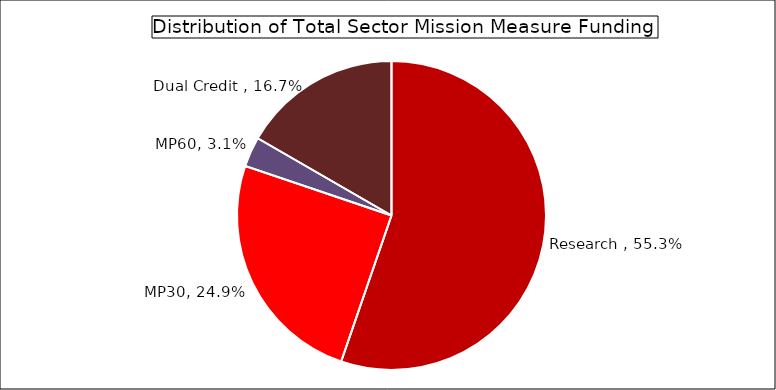
| Category | Series 0 |
|---|---|
| Research  | 0.553 |
| MP30 | 0.249 |
| MP60 | 0.031 |
| Dual Credit  | 0.167 |